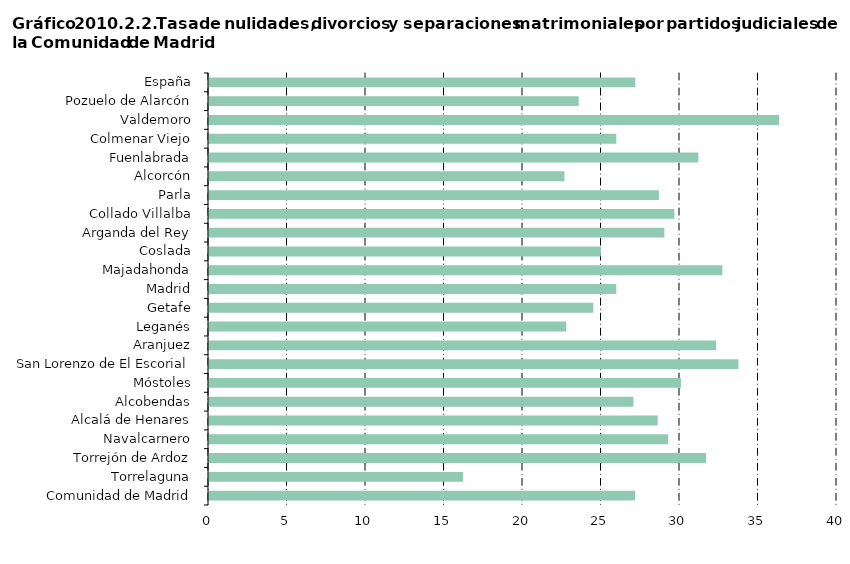
| Category | Series 0 |
|---|---|
| Comunidad de Madrid | 27.143 |
|     Torrelaguna | 16.183 |
|     Torrejón de Ardoz | 31.66 |
|     Navalcarnero | 29.25 |
|     Alcalá de Henares | 28.581 |
|     Alcobendas | 27.031 |
|     Móstoles | 30.06 |
|     San Lorenzo de El Escorial | 33.723 |
|     Aranjuez | 32.3 |
|     Leganés | 22.753 |
|     Getafe | 24.478 |
|     Madrid | 25.942 |
|     Majadahonda | 32.698 |
|     Coslada | 24.958 |
|     Arganda del Rey | 29.005 |
|     Collado Villalba | 29.644 |
|     Parla | 28.657 |
|     Alcorcón | 22.638 |
|     Fuenlabrada | 31.17 |
|     Colmenar Viejo | 25.944 |
|     Valdemoro | 36.314 |
|     Pozuelo de Alarcón | 23.55 |
| España | 27.154 |